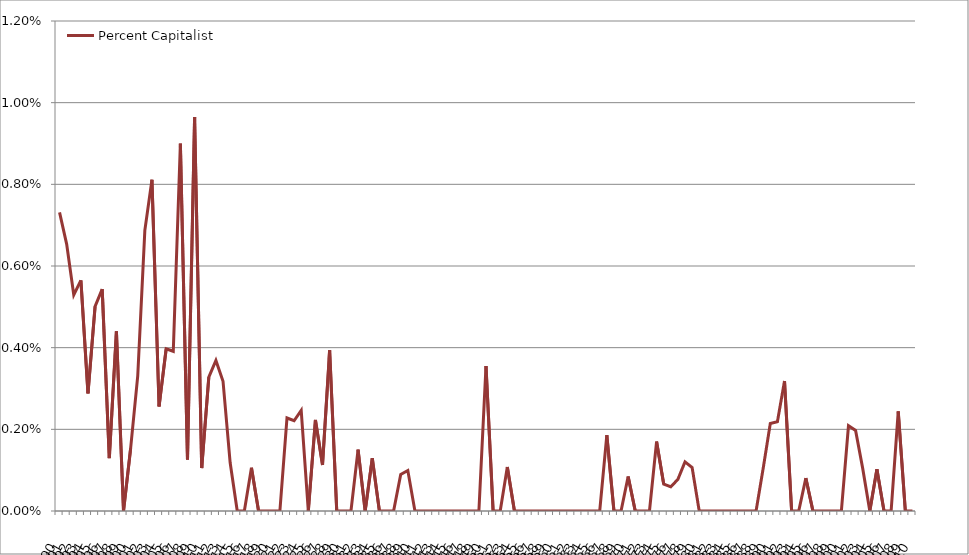
| Category | Percent Capitalist |
|---|---|
| 1890.0 | 0.007 |
| 1891.0 | 0.007 |
| 1892.0 | 0.005 |
| 1893.0 | 0.006 |
| 1894.0 | 0.003 |
| 1895.0 | 0.005 |
| 1896.0 | 0.005 |
| 1897.0 | 0.001 |
| 1898.0 | 0.004 |
| 1899.0 | 0 |
| 1900.0 | 0.002 |
| 1901.0 | 0.003 |
| 1902.0 | 0.007 |
| 1903.0 | 0.008 |
| 1904.0 | 0.003 |
| 1905.0 | 0.004 |
| 1906.0 | 0.004 |
| 1907.0 | 0.009 |
| 1908.0 | 0.001 |
| 1909.0 | 0.01 |
| 1910.0 | 0.001 |
| 1911.0 | 0.003 |
| 1912.0 | 0.004 |
| 1913.0 | 0.003 |
| 1914.0 | 0.001 |
| 1915.0 | 0 |
| 1916.0 | 0 |
| 1917.0 | 0.001 |
| 1918.0 | 0 |
| 1919.0 | 0 |
| 1920.0 | 0 |
| 1921.0 | 0 |
| 1922.0 | 0.002 |
| 1923.0 | 0.002 |
| 1924.0 | 0.002 |
| 1925.0 | 0 |
| 1926.0 | 0.002 |
| 1927.0 | 0.001 |
| 1928.0 | 0.004 |
| 1929.0 | 0 |
| 1930.0 | 0 |
| 1931.0 | 0 |
| 1932.0 | 0.002 |
| 1933.0 | 0 |
| 1934.0 | 0.001 |
| 1935.0 | 0 |
| 1936.0 | 0 |
| 1937.0 | 0 |
| 1938.0 | 0.001 |
| 1939.0 | 0.001 |
| 1940.0 | 0 |
| 1941.0 | 0 |
| 1942.0 | 0 |
| 1943.0 | 0 |
| 1944.0 | 0 |
| 1945.0 | 0 |
| 1946.0 | 0 |
| 1947.0 | 0 |
| 1948.0 | 0 |
| 1949.0 | 0 |
| 1950.0 | 0.004 |
| 1951.0 | 0 |
| 1952.0 | 0 |
| 1953.0 | 0.001 |
| 1954.0 | 0 |
| 1955.0 | 0 |
| 1956.0 | 0 |
| 1957.0 | 0 |
| 1958.0 | 0 |
| 1959.0 | 0 |
| 1960.0 | 0 |
| 1961.0 | 0 |
| 1962.0 | 0 |
| 1963.0 | 0 |
| 1964.0 | 0 |
| 1965.0 | 0 |
| 1966.0 | 0 |
| 1967.0 | 0.002 |
| 1968.0 | 0 |
| 1969.0 | 0 |
| 1970.0 | 0.001 |
| 1971.0 | 0 |
| 1972.0 | 0 |
| 1973.0 | 0 |
| 1974.0 | 0.002 |
| 1975.0 | 0.001 |
| 1976.0 | 0.001 |
| 1977.0 | 0.001 |
| 1978.0 | 0.001 |
| 1979.0 | 0.001 |
| 1980.0 | 0 |
| 1981.0 | 0 |
| 1982.0 | 0 |
| 1983.0 | 0 |
| 1984.0 | 0 |
| 1985.0 | 0 |
| 1986.0 | 0 |
| 1987.0 | 0 |
| 1988.0 | 0 |
| 1989.0 | 0.001 |
| 1990.0 | 0.002 |
| 1991.0 | 0.002 |
| 1992.0 | 0.003 |
| 1993.0 | 0 |
| 1994.0 | 0 |
| 1995.0 | 0.001 |
| 1996.0 | 0 |
| 1997.0 | 0 |
| 1998.0 | 0 |
| 1999.0 | 0 |
| 2000.0 | 0 |
| 2001.0 | 0.002 |
| 2002.0 | 0.002 |
| 2003.0 | 0.001 |
| 2004.0 | 0 |
| 2005.0 | 0.001 |
| 2006.0 | 0 |
| 2007.0 | 0 |
| 2008.0 | 0.002 |
| 2009.0 | 0 |
| 2010.0 | 0 |